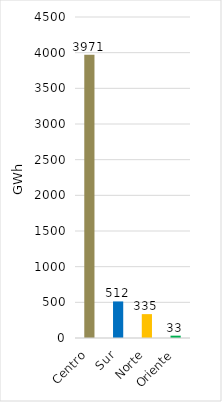
| Category | Series 0 |
|---|---|
| Centro | 3970.892 |
| Sur | 512.442 |
| Norte | 334.617 |
| Oriente | 32.74 |